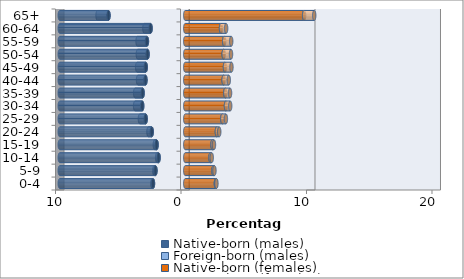
| Category | Native-born (males) | Foreign-born (males) | Native-born (females) | Foreign-born (females) |
|---|---|---|---|---|
| 0-4 | -2.571 | -0.05 | 2.44 | 0.044 |
| 5-9 | -2.373 | -0.091 | 2.246 | 0.081 |
| 10-14 | -2.125 | -0.114 | 2.009 | 0.101 |
| 15-19 | -2.283 | -0.141 | 2.171 | 0.117 |
| 20-24 | -2.669 | -0.263 | 2.521 | 0.187 |
| 25-29 | -3.152 | -0.462 | 2.953 | 0.285 |
| 30-34 | -3.43 | -0.566 | 3.245 | 0.336 |
| 35-39 | -3.398 | -0.594 | 3.194 | 0.376 |
| 40-44 | -3.17 | -0.592 | 3.057 | 0.412 |
| 45-49 | -3.147 | -0.687 | 3.165 | 0.516 |
| 50-54 | -3.003 | -0.775 | 3.062 | 0.584 |
| 55-59 | -3.054 | -0.747 | 3.101 | 0.56 |
| 60-64 | -2.761 | -0.495 | 2.85 | 0.408 |
| 65+ | -6.115 | -0.873 | 9.474 | 0.803 |